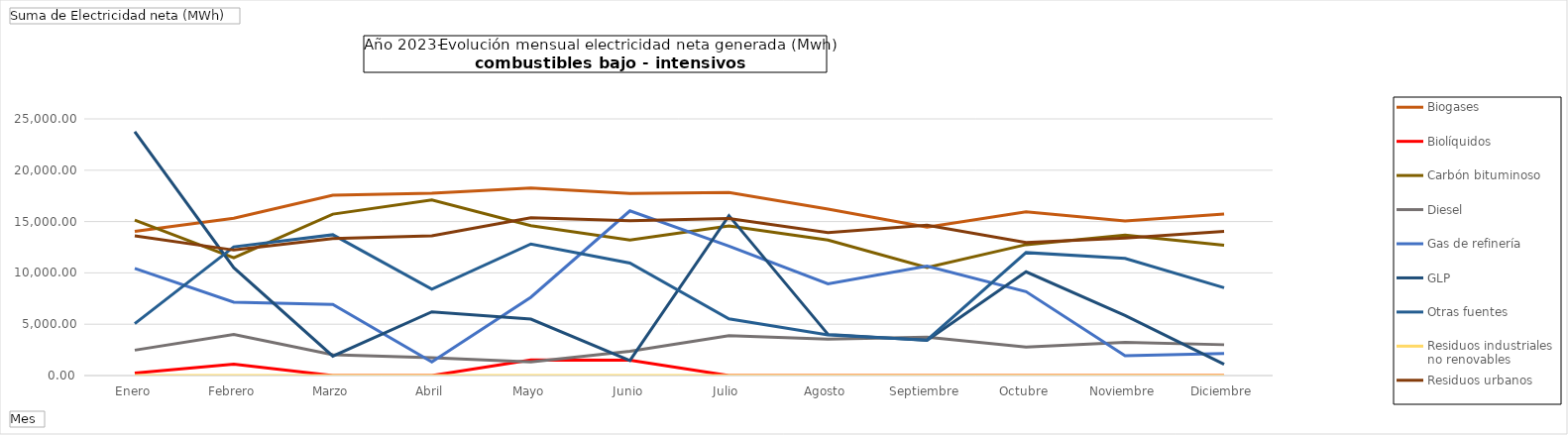
| Category | Biogases | Biolíquidos | Carbón bituminoso | Diesel | Gas de refinería | GLP | Otras fuentes | Residuos industriales no renovables | Residuos urbanos |
|---|---|---|---|---|---|---|---|---|---|
| Enero | 14049.43 | 230.76 | 15137.44 | 2474.03 | 10438.48 | 23760.02 | 5059.21 | 0 | 13611.59 |
| Febrero | 15324.86 | 1115.17 | 11482.9 | 4013.32 | 7152.26 | 10498.67 | 12541.43 | 0 | 12223.83 |
| Marzo | 17569.01 | 0 | 15720.84 | 2023.93 | 6928.33 | 1891.72 | 13714.79 | 0 | 13351.79 |
| Abril | 17752.43 | 0 | 17113.53 | 1735.93 | 1328.47 | 6201.26 | 8409.53 | 0 | 13617.1 |
| Mayo | 18268.11 | 1511.43 | 14599.2 | 1325.14 | 7630.85 | 5500.99 | 12816.45 | 0 | 15365.85 |
| Junio | 17726.34 | 1495.65 | 13189.39 | 2370.45 | 16044.48 | 1458.59 | 10951.3 | 0 | 15075.81 |
| Julio | 17835.43 | 0 | 14564.84 | 3876.22 | 12616.95 | 15578.18 | 5516.47 | 0 | 15297.1 |
| Agosto | 16213.97 | 0 | 13204.67 | 3538.95 | 8940.06 | 4015.83 | 3963.07 | 0 | 13931.21 |
| Septiembre | 14445.96 | 0 | 10525.9 | 3740.82 | 10657.73 | 3417.81 | 3457.6 | 0 | 14649.64 |
| Octubre | 15947.53 | 0 | 12752.47 | 2769.86 | 8169.98 | 10103.24 | 11980.77 | 0 | 12965.71 |
| Noviembre | 15051.85 | 0 | 13676.5 | 3239.21 | 1939.75 | 5845.88 | 11420.04 | 0 | 13398.12 |
| Diciembre | 15728.62 | 0 | 12698.71 | 3004.36 | 2144.88 | 1093.94 | 8548.64 | 0 | 14036.81 |